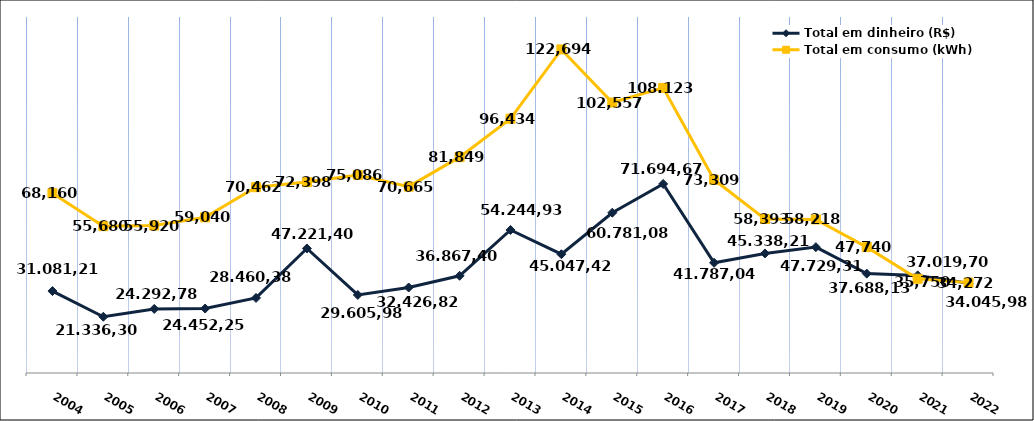
| Category | Total em dinheiro (R$) |
|---|---|
| 2004.0 | 31081.21 |
| 2005.0 | 21336.3 |
| 2006.0 | 24292.78 |
| 2007.0 | 24452.25 |
| 2008.0 | 28460.38 |
| 2009.0 | 47221.4 |
| 2010.0 | 29605.98 |
| 2011.0 | 32426.82 |
| 2012.0 | 36867.4 |
| 2013.0 | 54244.93 |
| 2014.0 | 45047.42 |
| 2015.0 | 60781.08 |
| 2016.0 | 71694.67 |
| 2017.0 | 41787.04 |
| 2018.0 | 45338.21 |
| 2019.0 | 47729.31 |
| 2020.0 | 37688.13 |
| 2021.0 | 37019.7 |
| 2022.0 | 34045.98 |